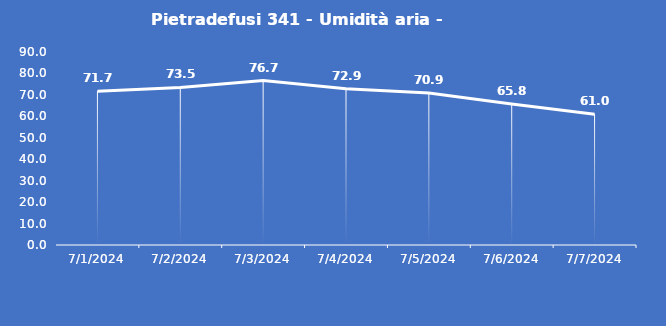
| Category | Pietradefusi 341 - Umidità aria - Grezzo (%) |
|---|---|
| 7/1/24 | 71.7 |
| 7/2/24 | 73.5 |
| 7/3/24 | 76.7 |
| 7/4/24 | 72.9 |
| 7/5/24 | 70.9 |
| 7/6/24 | 65.8 |
| 7/7/24 | 61 |